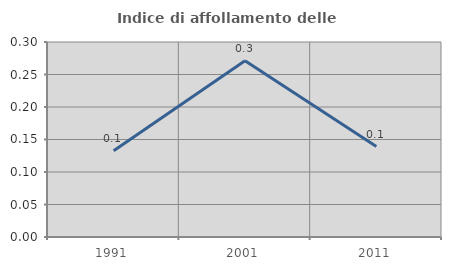
| Category | Indice di affollamento delle abitazioni  |
|---|---|
| 1991.0 | 0.133 |
| 2001.0 | 0.271 |
| 2011.0 | 0.139 |